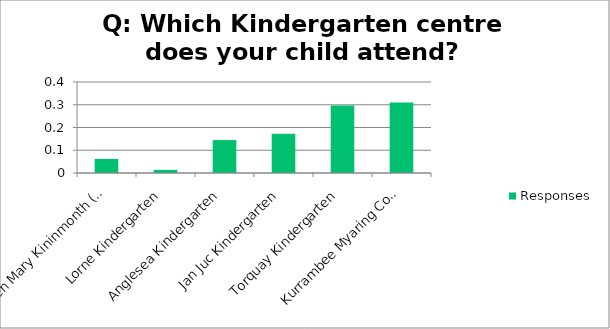
| Category | Responses |
|---|---|
| Helen Mary Kininmonth (HMK) Preschool | 0.062 |
| Lorne Kindergarten | 0.014 |
| Anglesea Kindergarten | 0.145 |
| Jan Juc Kindergarten | 0.172 |
| Torquay Kindergarten | 0.297 |
| Kurrambee Myaring Community Centre (KMCC) Kindergarten | 0.31 |